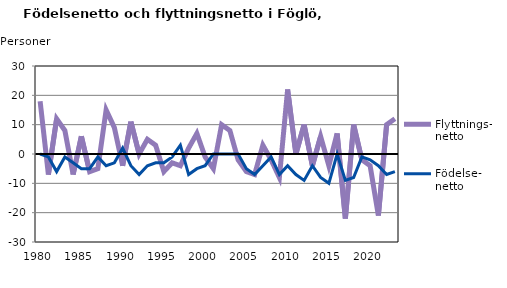
| Category | Flyttnings- netto | Födelse- netto |
|---|---|---|
| 1980.0 | 18 | 0 |
| 1981.0 | -7 | -1 |
| 1982.0 | 12 | -6 |
| 1983.0 | 8 | -1 |
| 1984.0 | -7 | -3 |
| 1985.0 | 6 | -5 |
| 1986.0 | -6 | -5 |
| 1987.0 | -5 | -1 |
| 1988.0 | 15 | -4 |
| 1989.0 | 9 | -3 |
| 1990.0 | -4 | 2 |
| 1991.0 | 11 | -4 |
| 1992.0 | 0 | -7 |
| 1993.0 | 5 | -4 |
| 1994.0 | 3 | -3 |
| 1995.0 | -6 | -3 |
| 1996.0 | -3 | -1 |
| 1997.0 | -4 | 3 |
| 1998.0 | 2 | -7 |
| 1999.0 | 7 | -5 |
| 2000.0 | -1 | -4 |
| 2001.0 | -5 | 0 |
| 2002.0 | 10 | 0 |
| 2003.0 | 8 | 0 |
| 2004.0 | -2 | 0 |
| 2005.0 | -6 | -5 |
| 2006.0 | -7 | -7 |
| 2007.0 | 3 | -4 |
| 2008.0 | -2 | -1 |
| 2009.0 | -8 | -7 |
| 2010.0 | 22 | -4 |
| 2011.0 | 0 | -7 |
| 2012.0 | 10 | -9 |
| 2013.0 | -4 | -4 |
| 2014.0 | 6 | -8 |
| 2015.0 | -4 | -10 |
| 2016.0 | 7 | 0 |
| 2017.0 | -22 | -9 |
| 2018.0 | 10 | -8 |
| 2019.0 | -2 | -1 |
| 2020.0 | -4 | -2 |
| 2021.0 | -21 | -4 |
| 2022.0 | 10 | -7 |
| 2023.0 | 12 | -6 |